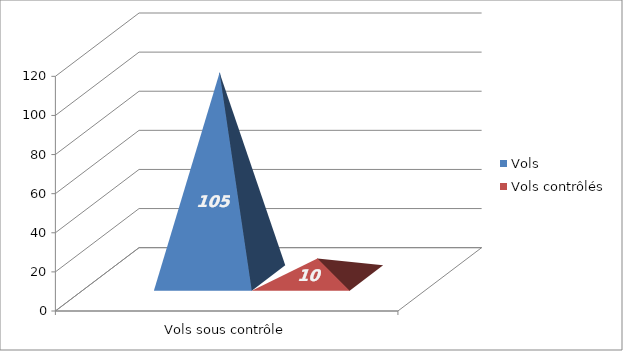
| Category | Vols | Vols contrôlés |
|---|---|---|
| 0 | 105 | 10 |